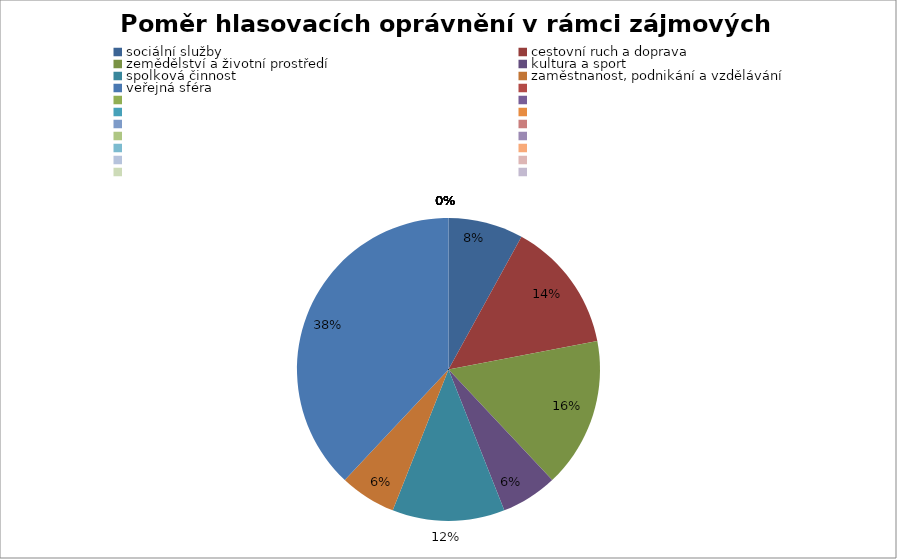
| Category | Series 0 |
|---|---|
| sociální služby | 0.08 |
| cestovní ruch a doprava | 0.14 |
| zemědělství a životní prostředí | 0.16 |
| kultura a sport | 0.06 |
| spolková činnost | 0.12 |
| zaměstnanost, podnikání a vzdělávání | 0.06 |
| veřejná sféra | 0.38 |